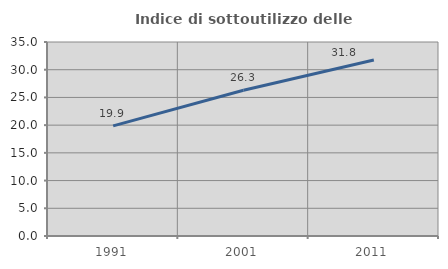
| Category | Indice di sottoutilizzo delle abitazioni  |
|---|---|
| 1991.0 | 19.876 |
| 2001.0 | 26.302 |
| 2011.0 | 31.755 |